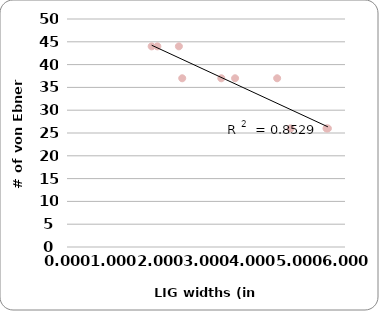
| Category | Series 0 |
|---|---|
| 5.630777777777777 | 26 |
| 5.60075 | 26 |
| 4.8266 | 26 |
| 2.486666666666667 | 37 |
| 4.535666666666667 | 37 |
| 3.6276666666666664 | 37 |
| 3.3304 | 37 |
| 1.8274444444444444 | 44 |
| 1.9502727272727272 | 44 |
| 2.4147777777777777 | 44 |